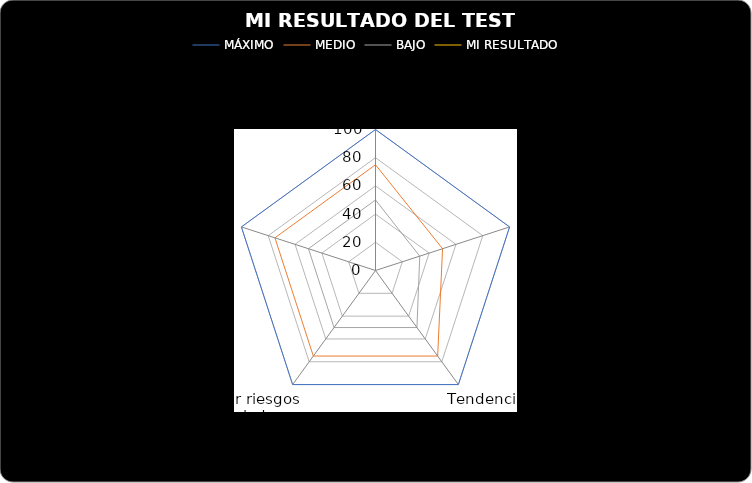
| Category | MÁXIMO | MEDIO | BAJO | MI RESULTADO |
|---|---|---|---|---|
| Necesidad de logro | 100 | 75 | 50 |  |
| Necesidad de autonomía / independencia | 100 | 50 | 33 |  |
| Tendencia creativa | 100 | 75 | 50 |  |
| Asumir riesgos calculados | 100 | 75 | 50 |  |
| Creencia de éxito basado en el propio esfuerzo | 100 | 75 | 50 |  |